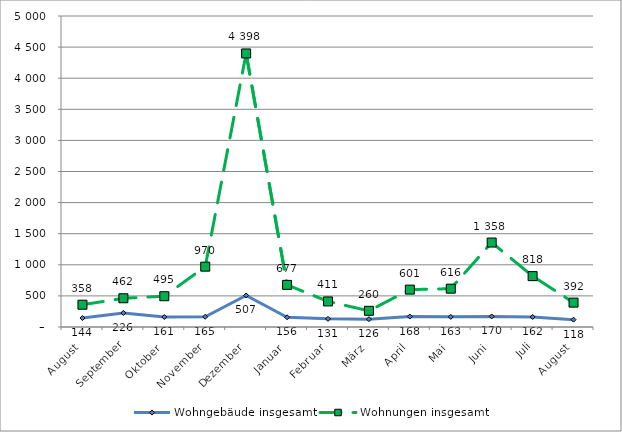
| Category | Wohngebäude insgesamt | Wohnungen insgesamt |
|---|---|---|
| August | 144 | 358 |
| September | 226 | 462 |
| Oktober | 161 | 495 |
| November | 165 | 970 |
| Dezember | 507 | 4398 |
| Januar | 156 | 677 |
| Februar | 131 | 411 |
| März | 126 | 260 |
| April | 168 | 601 |
| Mai | 163 | 616 |
| Juni | 170 | 1358 |
| Juli | 162 | 818 |
| August | 118 | 392 |